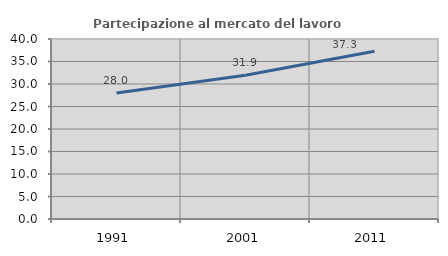
| Category | Partecipazione al mercato del lavoro  femminile |
|---|---|
| 1991.0 | 28.019 |
| 2001.0 | 31.948 |
| 2011.0 | 37.26 |